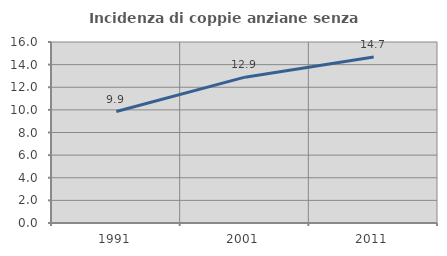
| Category | Incidenza di coppie anziane senza figli  |
|---|---|
| 1991.0 | 9.851 |
| 2001.0 | 12.892 |
| 2011.0 | 14.665 |